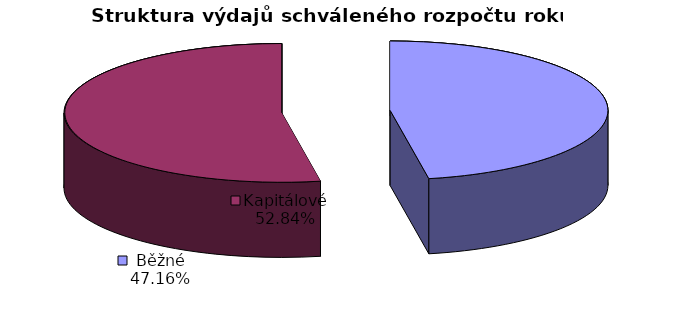
| Category | Schválený rozpočet |
|---|---|
| Běžné | 76219 |
| Kapitálové | 85412 |